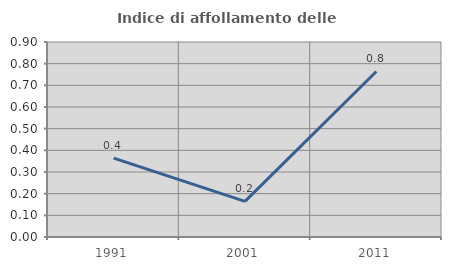
| Category | Indice di affollamento delle abitazioni  |
|---|---|
| 1991.0 | 0.364 |
| 2001.0 | 0.164 |
| 2011.0 | 0.764 |